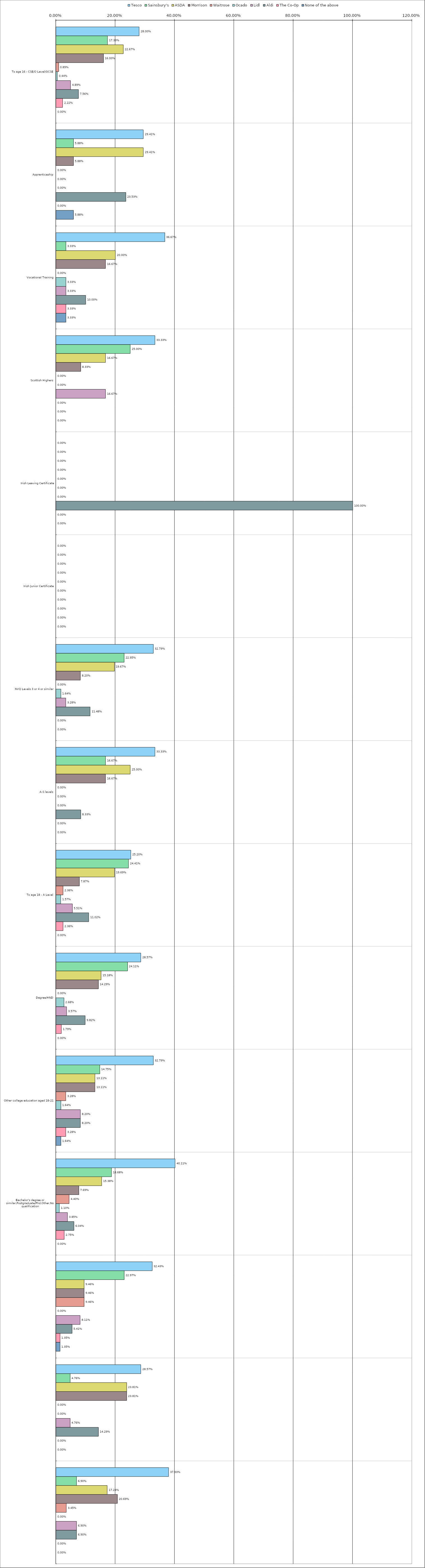
| Category | Tesco | Sainsbury's | ASDA | Morrison | Waitrose | Ocado | Lidl | Aldi | The Co-Op | None of the above |
|---|---|---|---|---|---|---|---|---|---|---|
| 0 | 0.28 | 0.173 | 0.227 | 0.16 | 0.009 | 0.004 | 0.049 | 0.076 | 0.022 | 0 |
| 1 | 0.294 | 0.059 | 0.294 | 0.059 | 0 | 0 | 0 | 0.235 | 0 | 0.059 |
| 2 | 0.367 | 0.033 | 0.2 | 0.167 | 0 | 0.033 | 0.033 | 0.1 | 0.033 | 0.033 |
| 3 | 0.333 | 0.25 | 0.167 | 0.083 | 0 | 0 | 0.167 | 0 | 0 | 0 |
| 4 | 0 | 0 | 0 | 0 | 0 | 0 | 0 | 1 | 0 | 0 |
| 5 | 0 | 0 | 0 | 0 | 0 | 0 | 0 | 0 | 0 | 0 |
| 6 | 0.328 | 0.23 | 0.197 | 0.082 | 0 | 0.016 | 0.033 | 0.115 | 0 | 0 |
| 7 | 0.333 | 0.167 | 0.25 | 0.167 | 0 | 0 | 0 | 0.083 | 0 | 0 |
| 8 | 0.252 | 0.244 | 0.197 | 0.079 | 0.024 | 0.016 | 0.055 | 0.11 | 0.024 | 0 |
| 9 | 0.286 | 0.241 | 0.152 | 0.143 | 0 | 0.027 | 0.036 | 0.098 | 0.018 | 0 |
| 10 | 0.328 | 0.148 | 0.131 | 0.131 | 0.033 | 0.016 | 0.082 | 0.082 | 0.033 | 0.016 |
| 11 | 0.401 | 0.187 | 0.154 | 0.077 | 0.044 | 0.011 | 0.038 | 0.06 | 0.028 | 0 |
| 12 | 0.324 | 0.23 | 0.095 | 0.095 | 0.095 | 0 | 0.081 | 0.054 | 0.014 | 0.014 |
| 13 | 0.286 | 0.048 | 0.238 | 0.238 | 0 | 0 | 0.048 | 0.143 | 0 | 0 |
| 14 | 0.379 | 0.069 | 0.172 | 0.207 | 0.034 | 0 | 0.069 | 0.069 | 0 | 0 |